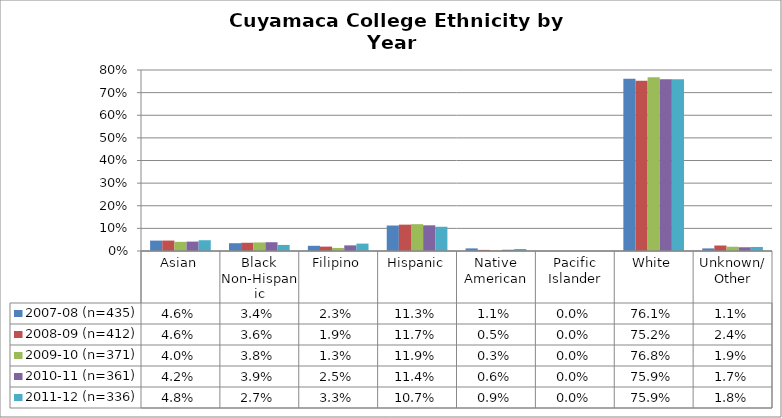
| Category | 2007-08 (n=435) | 2008-09 (n=412) | 2009-10 (n=371) | 2010-11 (n=361) | 2011-12 (n=336) |
|---|---|---|---|---|---|
| Asian | 0.046 | 0.046 | 0.04 | 0.042 | 0.048 |
| Black Non-Hispanic | 0.034 | 0.036 | 0.038 | 0.039 | 0.027 |
| Filipino | 0.023 | 0.019 | 0.013 | 0.025 | 0.033 |
| Hispanic | 0.113 | 0.117 | 0.119 | 0.114 | 0.107 |
| Native American | 0.011 | 0.005 | 0.003 | 0.006 | 0.009 |
| Pacific Islander | 0 | 0 | 0 | 0 | 0 |
| White | 0.761 | 0.752 | 0.768 | 0.759 | 0.759 |
| Unknown/ Other | 0.011 | 0.024 | 0.019 | 0.017 | 0.018 |